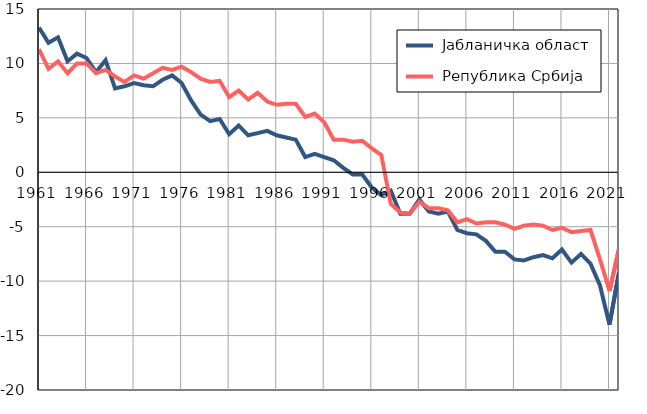
| Category |  Јабланичка област |  Република Србија |
|---|---|---|
| 1961.0 | 13.3 | 11.3 |
| 1962.0 | 11.9 | 9.5 |
| 1963.0 | 12.4 | 10.2 |
| 1964.0 | 10.2 | 9.1 |
| 1965.0 | 10.9 | 10 |
| 1966.0 | 10.5 | 10 |
| 1967.0 | 9.2 | 9.1 |
| 1968.0 | 10.3 | 9.4 |
| 1969.0 | 7.7 | 8.8 |
| 1970.0 | 7.9 | 8.3 |
| 1971.0 | 8.2 | 8.9 |
| 1972.0 | 8 | 8.6 |
| 1973.0 | 7.9 | 9.1 |
| 1974.0 | 8.5 | 9.6 |
| 1975.0 | 8.9 | 9.4 |
| 1976.0 | 8.2 | 9.7 |
| 1977.0 | 6.6 | 9.2 |
| 1978.0 | 5.3 | 8.6 |
| 1979.0 | 4.7 | 8.3 |
| 1980.0 | 4.9 | 8.4 |
| 1981.0 | 3.5 | 6.9 |
| 1982.0 | 4.3 | 7.5 |
| 1983.0 | 3.4 | 6.7 |
| 1984.0 | 3.6 | 7.3 |
| 1985.0 | 3.8 | 6.5 |
| 1986.0 | 3.4 | 6.2 |
| 1987.0 | 3.2 | 6.3 |
| 1988.0 | 3 | 6.3 |
| 1989.0 | 1.4 | 5.1 |
| 1990.0 | 1.7 | 5.4 |
| 1991.0 | 1.4 | 4.6 |
| 1992.0 | 1.1 | 3 |
| 1993.0 | 0.4 | 3 |
| 1994.0 | -0.2 | 2.8 |
| 1995.0 | -0.2 | 2.9 |
| 1996.0 | -1.4 | 2.2 |
| 1997.0 | -2.1 | 1.6 |
| 1998.0 | -1.7 | -2.9 |
| 1999.0 | -3.8 | -3.7 |
| 2000.0 | -3.8 | -3.8 |
| 2001.0 | -2.5 | -2.7 |
| 2002.0 | -3.6 | -3.3 |
| 2003.0 | -3.8 | -3.3 |
| 2004.0 | -3.6 | -3.5 |
| 2005.0 | -5.3 | -4.6 |
| 2006.0 | -5.6 | -4.3 |
| 2007.0 | -5.7 | -4.7 |
| 2008.0 | -6.3 | -4.6 |
| 2009.0 | -7.3 | -4.6 |
| 2010.0 | -7.3 | -4.8 |
| 2011.0 | -8 | -5.2 |
| 2012.0 | -8.1 | -4.9 |
| 2013.0 | -7.8 | -4.8 |
| 2014.0 | -7.6 | -4.9 |
| 2015.0 | -7.9 | -5.3 |
| 2016.0 | -7.1 | -5.1 |
| 2017.0 | -8.3 | -5.5 |
| 2018.0 | -7.5 | -5.4 |
| 2019.0 | -8.4 | -5.3 |
| 2020.0 | -10.4 | -8 |
| 2021.0 | -14 | -10.9 |
| 2022.0 | -9.2 | -7 |